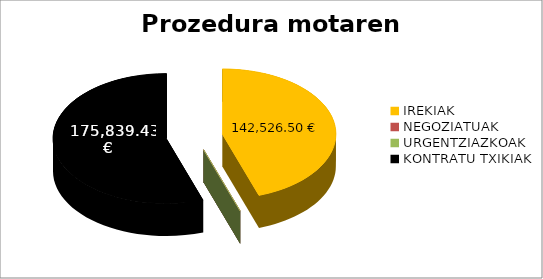
| Category | Prozedura motaren arabera |
|---|---|
| IREKIAK | 142526.5 |
| NEGOZIATUAK | 0 |
| URGENTZIAZKOAK | 0 |
| KONTRATU TXIKIAK | 175839.43 |